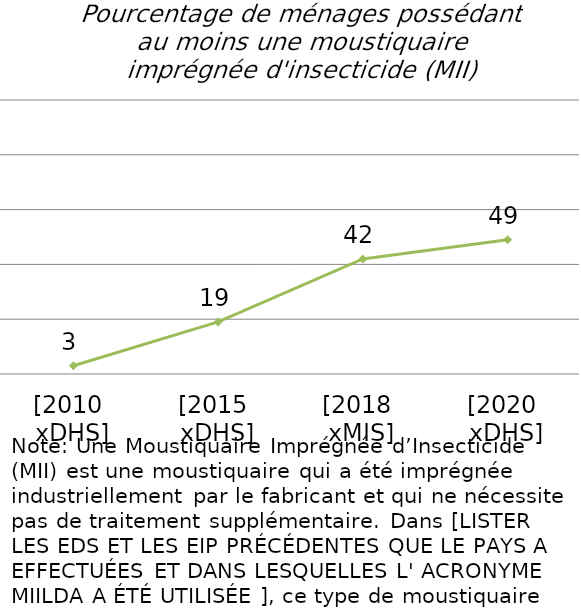
| Category | Series 0 |
|---|---|
| [2010 
xDHS] | 3 |
| [2015 
xDHS] | 19 |
| [2018 
xMIS] | 42 |
| [2020 
xDHS] | 49 |